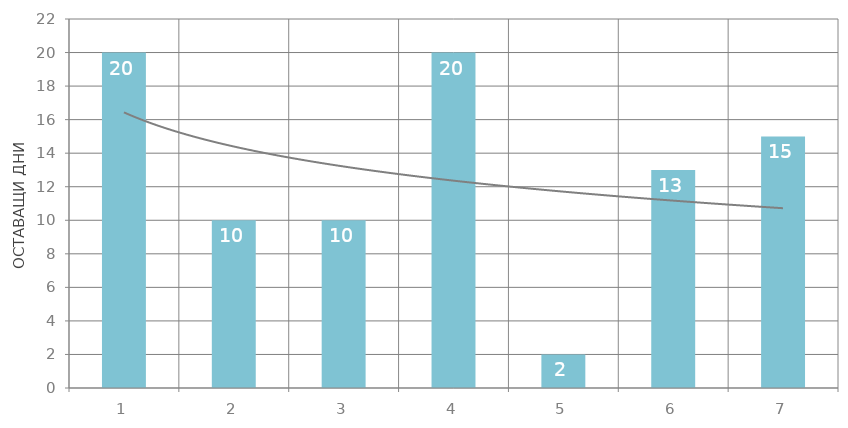
| Category | Общо |
|---|---|
| 1 | 20 |
| 2 | 10 |
| 3 | 10 |
| 4 | 20 |
| 5 | 2 |
| 6 | 13 |
| 7 | 15 |